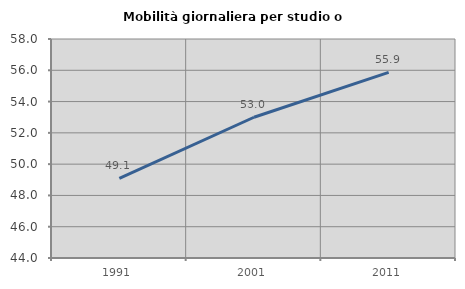
| Category | Mobilità giornaliera per studio o lavoro |
|---|---|
| 1991.0 | 49.093 |
| 2001.0 | 52.998 |
| 2011.0 | 55.863 |